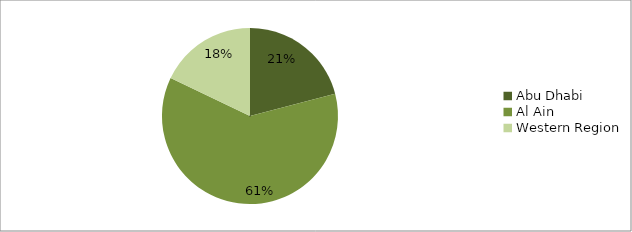
| Category | Abu Dhabi |
|---|---|
| Abu Dhabi | 570437 |
| Al Ain | 1667948 |
| Western Region | 488286 |